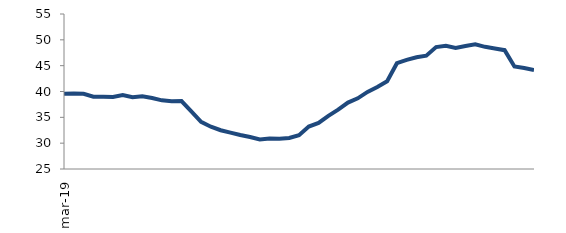
| Category | Series 0 |
|---|---|
| 2019-03-01 | 39.552 |
| 2019-04-01 | 39.625 |
| 2019-05-01 | 39.543 |
| 2019-06-01 | 38.994 |
| 2019-07-01 | 38.99 |
| 2019-08-01 | 38.936 |
| 2019-09-01 | 39.294 |
| 2019-10-01 | 38.876 |
| 2019-11-01 | 39.061 |
| 2019-12-01 | 38.744 |
| 2020-01-01 | 38.288 |
| 2020-02-01 | 38.128 |
| 2020-03-01 | 38.143 |
| 2020-04-01 | 36.141 |
| 2020-05-01 | 34.114 |
| 2020-06-01 | 33.191 |
| 2020-07-01 | 32.506 |
| 2020-08-01 | 32.045 |
| 2020-09-01 | 31.572 |
| 2020-10-01 | 31.184 |
| 2020-11-01 | 30.726 |
| 2020-12-01 | 30.899 |
| 2021-01-01 | 30.834 |
| 2021-02-01 | 30.995 |
| 2021-03-01 | 31.535 |
| 2021-04-01 | 33.22 |
| 2021-05-01 | 33.912 |
| 2021-06-01 | 35.282 |
| 2021-07-01 | 36.501 |
| 2021-08-01 | 37.863 |
| 2021-09-01 | 38.674 |
| 2021-10-01 | 39.929 |
| 2021-11-01 | 40.877 |
| 2021-12-01 | 41.971 |
| 2022-01-01 | 45.477 |
| 2022-02-01 | 46.119 |
| 2022-03-01 | 46.637 |
| 2022-04-01 | 46.937 |
| 2022-05-01 | 48.594 |
| 2022-06-01 | 48.846 |
| 2022-07-01 | 48.431 |
| 2022-08-01 | 48.822 |
| 2022-09-01 | 49.123 |
| 2022-10-01 | 48.644 |
| 2022-11-01 | 48.315 |
| 2022-12-01 | 48.003 |
| 2023-01-01 | 44.844 |
| 2023-02-01 | 44.552 |
| 2023-03-01 | 44.166 |